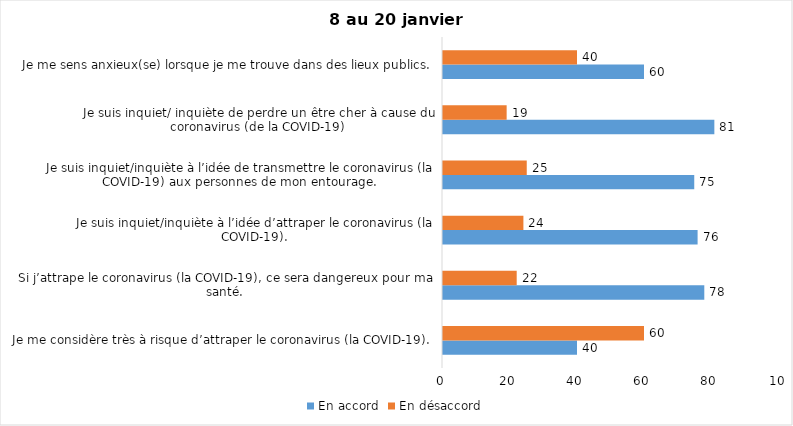
| Category | En accord | En désaccord |
|---|---|---|
| Je me considère très à risque d’attraper le coronavirus (la COVID-19). | 40 | 60 |
| Si j’attrape le coronavirus (la COVID-19), ce sera dangereux pour ma santé. | 78 | 22 |
| Je suis inquiet/inquiète à l’idée d’attraper le coronavirus (la COVID-19). | 76 | 24 |
| Je suis inquiet/inquiète à l’idée de transmettre le coronavirus (la COVID-19) aux personnes de mon entourage. | 75 | 25 |
| Je suis inquiet/ inquiète de perdre un être cher à cause du coronavirus (de la COVID-19) | 81 | 19 |
| Je me sens anxieux(se) lorsque je me trouve dans des lieux publics. | 60 | 40 |